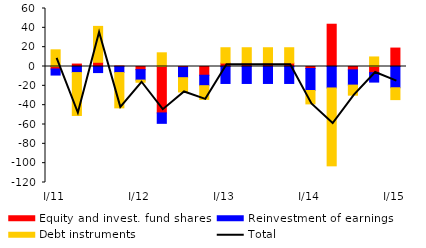
| Category | Equity and invest. fund shares | Reinvestment of earnings | Debt instruments |
|---|---|---|---|
| I/11 | -2.569 | -6.291 | 17.255 |
| II | 2.527 | -6.291 | -44.364 |
| III | 4.362 | -6.291 | 37.132 |
| IV | 0.507 | -6.291 | -36.489 |
| I/12 | -3.253 | -10.785 | -2.251 |
| II | -48.016 | -10.785 | 14.16 |
| III | -0.777 | -10.785 | -14.771 |
| IV | -9.051 | -10.785 | -14.161 |
| I/13 | 3.515 | -17.551 | 15.896 |
| II | 3.515 | -17.551 | 15.896 |
| III | 3.515 | -17.551 | 15.896 |
| IV | 3.515 | -17.551 | 15.896 |
| I/14 | -2.088 | -22.755 | -13.843 |
| II | 43.736 | -22.199 | -80.565 |
| III | -3.51 | -15.748 | -10.404 |
| IV | -6.372 | -9.765 | 9.879 |
| I/15 | 19.073 | -21.986 | -12.274 |